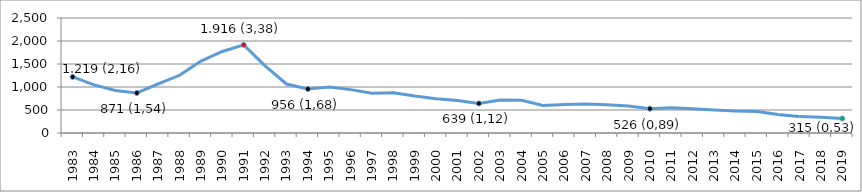
| Category | Series 0 |
|---|---|
| 1983 | 1219 |
| 1984 | 1047 |
| 1985 | 924 |
| 1986 | 871 |
| 1987 | 1069 |
| 1988 | 1255 |
| 1989 | 1563 |
| 1990 | 1773 |
| 1991 | 1916 |
| 1992 | 1461 |
| 1993 | 1065 |
| 1994 | 956 |
| 1995 | 1000 |
| 1996 | 943 |
| 1997 | 863 |
| 1998 | 876 |
| 1999 | 805 |
| 2000 | 746 |
| 2001 | 704 |
| 2002 | 642 |
| 2003 | 716 |
| 2004 | 711 |
| 2005 | 600 |
| 2006 | 620 |
| 2007 | 632 |
| 2008 | 613 |
| 2009 | 589 |
| 2010 | 528 |
| 2011 | 551 |
| 2012 | 528 |
| 2013 | 502 |
| 2014 | 476 |
| 2015 | 469 |
| 2016 | 400 |
| 2017 | 357 |
| 2018 | 345 |
| 2019 | 315 |